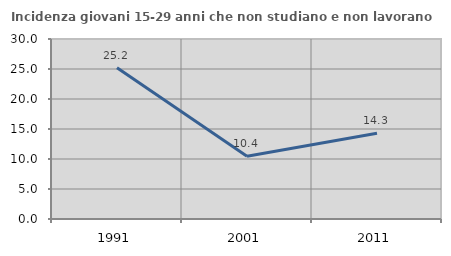
| Category | Incidenza giovani 15-29 anni che non studiano e non lavorano  |
|---|---|
| 1991.0 | 25.203 |
| 2001.0 | 10.448 |
| 2011.0 | 14.286 |